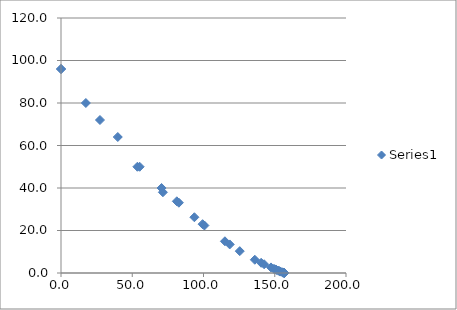
| Category | Series 0 |
|---|---|
| 0.0 | 96 |
| 0.0 | 96 |
| 17.44 | 80 |
| 27.360000000000003 | 72 |
| 39.84 | 64 |
| 53.6 | 50 |
| 55.199999999999996 | 50 |
| 70.56 | 40 |
| 71.52 | 38 |
| 81.28 | 33.74 |
| 82.72 | 33.08 |
| 93.6 | 26.24 |
| 99.36 | 22.98 |
| 100.64 | 22.36 |
| 115.03999999999999 | 14.92 |
| 118.4 | 13.44 |
| 125.44 | 10.28 |
| 136.0 | 6.24 |
| 140.48 | 4.8 |
| 142.56 | 4.1 |
| 147.36 | 2.62 |
| 149.44 | 1.96 |
| 150.39999999999998 | 1.68 |
| 150.56 | 1.6 |
| 151.2 | 1.44 |
| 152.64 | 1.08 |
| 153.28 | 0.86 |
| 154.07999999999998 | 0.64 |
| 155.35999999999999 | 0.32 |
| 156.0 | 0.16 |
| 156.0 | 0.18 |
| 156.48 | 0.06 |
| 156.64 | 0 |
| 156.8 | 0 |